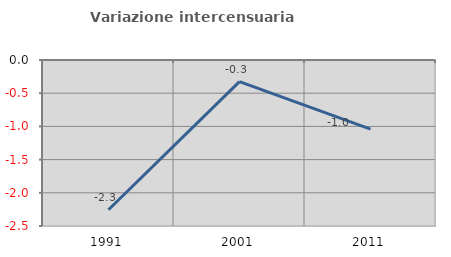
| Category | Variazione intercensuaria annua |
|---|---|
| 1991.0 | -2.255 |
| 2001.0 | -0.325 |
| 2011.0 | -1.04 |